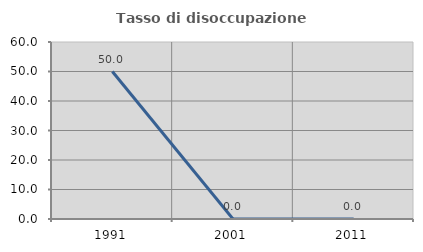
| Category | Tasso di disoccupazione giovanile  |
|---|---|
| 1991.0 | 50 |
| 2001.0 | 0 |
| 2011.0 | 0 |